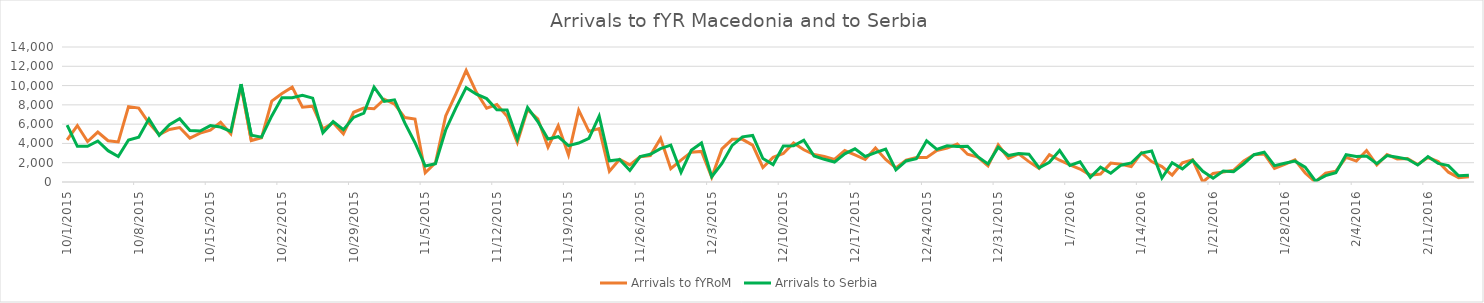
| Category | Arrivals to fYRoM | Arrivals to Serbia |
|---|---|---|
| 10/1/15 | 4370 | 5900 |
| 10/2/15 | 5853 | 3700 |
| 10/3/15 | 4202 | 3700 |
| 10/4/15 | 5181 | 4250 |
| 10/5/15 | 4282 | 3250 |
| 10/6/15 | 4156 | 2650 |
| 10/7/15 | 7816 | 4350 |
| 10/8/15 | 7663 | 4650 |
| 10/9/15 | 6107 | 6550 |
| 10/10/15 | 4922 | 4850 |
| 10/11/15 | 5448 | 5950 |
| 10/12/15 | 5645 | 6556 |
| 10/13/15 | 4551 | 5330 |
| 10/14/15 | 5073 | 5280 |
| 10/15/15 | 5373 | 5850 |
| 10/16/15 | 6181 | 5700 |
| 10/17/15 | 4988 | 5250 |
| 10/18/15 | 10005 | 10150 |
| 10/19/15 | 4299 | 4850 |
| 10/20/15 | 4584 | 4650 |
| 10/21/15 | 8384 | 6850 |
| 10/22/15 | 9174 | 8750 |
| 10/23/15 | 9840 | 8750 |
| 10/24/15 | 7752 | 9000 |
| 10/25/15 | 7864 | 8700 |
| 10/26/15 | 5500 | 5100 |
| 10/27/15 | 6146 | 6257 |
| 10/28/15 | 5000 | 5415 |
| 10/29/15 | 7231 | 6700 |
| 10/30/15 | 7663 | 7138 |
| 10/31/15 | 7590 | 9834 |
| 11/1/15 | 8584 | 8354 |
| 11/2/15 | 8075 | 8521 |
| 11/3/15 | 6682 | 6129 |
| 11/4/15 | 6532 | 4073 |
| 11/5/15 | 960 | 1652 |
| 11/6/15 | 1987 | 1906 |
| 11/7/15 | 6847 | 5397 |
| 11/8/15 | 9148 | 7695 |
| 11/9/15 | 11572 | 9785 |
| 11/10/15 | 9305 | 9107 |
| 11/11/15 | 7651 | 8648 |
| 11/12/15 | 8038 | 7500 |
| 11/13/15 | 6826 | 7464 |
| 11/14/15 | 4107 | 4453 |
| 11/15/15 | 7511 | 7734 |
| 11/16/15 | 6557 | 6267 |
| 11/17/15 | 3621 | 4460 |
| 11/18/15 | 5831 | 4694 |
| 11/19/15 | 2816 | 3765 |
| 11/20/15 | 7453 | 4042 |
| 11/21/15 | 5255 | 4527 |
| 11/22/15 | 5539 | 6826 |
| 11/23/15 | 1113 | 2201 |
| 11/24/15 | 2347 | 2335 |
| 11/25/15 | 1779 | 1194 |
| 11/26/15 | 2617 | 2636 |
| 11/27/15 | 2744 | 2878 |
| 11/28/15 | 4520 | 3454 |
| 11/29/15 | 1373 | 3825 |
| 11/30/15 | 2270 | 1009 |
| 12/1/15 | 3094 | 3284 |
| 12/2/15 | 3174 | 4040 |
| 12/3/15 | 494 | 553 |
| 12/4/15 | 3436 | 1927 |
| 12/5/15 | 4430 | 3799 |
| 12/6/15 | 4425 | 4686 |
| 12/7/15 | 3826 | 4823 |
| 12/8/15 | 1508 | 2437 |
| 12/9/15 | 2550 | 1807 |
| 12/10/15 | 2956 | 3723 |
| 12/11/15 | 4047 | 3747 |
| 12/12/15 | 3338 | 4339 |
| 12/13/15 | 2849 | 2698 |
| 12/14/15 | 2644 | 2353 |
| 12/15/15 | 2349 | 2067 |
| 12/16/15 | 3264 | 2916 |
| 12/17/15 | 2801 | 3438 |
| 12/18/15 | 2332 | 2649 |
| 12/19/15 | 3515 | 3052 |
| 12/20/15 | 2338 | 3405 |
| 12/21/15 | 1470 | 1253 |
| 12/22/15 | 2272 | 2186 |
| 12/23/15 | 2529 | 2415 |
| 12/24/15 | 2529 | 4279 |
| 12/25/15 | 3268 | 3390 |
| 12/26/15 | 3521 | 3757 |
| 12/27/15 | 3938 | 3674 |
| 12/28/15 | 2884 | 3708 |
| 12/29/15 | 2577 | 2629 |
| 12/30/15 | 1665 | 1879 |
| 12/31/15 | 3848 | 3602 |
| 1/1/16 | 2454 | 2745 |
| 1/2/16 | 2918 | 2947 |
| 1/3/16 | 2112 | 2889 |
| 1/4/16 | 1415 | 1462 |
| 1/5/16 | 2842 | 2041 |
| 1/6/16 | 2258 | 3273 |
| 1/7/16 | 1776 | 1715 |
| 1/8/16 | 1344 | 2100 |
| 1/9/16 | 715 | 489 |
| 1/10/16 | 819 | 1538 |
| 1/11/16 | 1959 | 905 |
| 1/12/16 | 1840 | 1743 |
| 1/13/16 | 1600 | 1973 |
| 1/14/16 | 3022 | 3006 |
| 1/15/16 | 2119 | 3213 |
| 1/16/16 | 1598 | 415 |
| 1/17/16 | 720 | 1995 |
| 1/18/16 | 1980 | 1362 |
| 1/19/16 | 2298 | 2244 |
| 1/20/16 | 0 | 1113 |
| 1/21/16 | 892 | 397 |
| 1/22/16 | 1030 | 1134 |
| 1/23/16 | 1208 | 1064 |
| 1/24/16 | 2174 | 1895 |
| 1/25/16 | 2836 | 2827 |
| 1/26/16 | 2908 | 3091 |
| 1/27/16 | 1402 | 1695 |
| 1/28/16 | 1837 | 1940 |
| 1/29/16 | 2292 | 2167 |
| 1/30/16 | 931 | 1540 |
| 1/31/16 | 0 | 103 |
| 2/1/16 | 908 | 660 |
| 2/2/16 | 1121 | 966 |
| 2/3/16 | 2558 | 2825 |
| 2/4/16 | 2173 | 2653 |
| 2/5/16 | 3259 | 2694 |
| 2/6/16 | 1780 | 1901 |
| 2/7/16 | 2838 | 2739 |
| 2/8/16 | 2392 | 2563 |
| 2/9/16 | 2441 | 2379 |
| 2/10/16 | 1817 | 1758 |
| 2/11/16 | 2540 | 2636 |
| 2/12/16 | 2115 | 1923 |
| 2/13/16 | 1019 | 1699 |
| 2/14/16 | 452 | 641 |
| 2/15/16 | 542 | 691 |